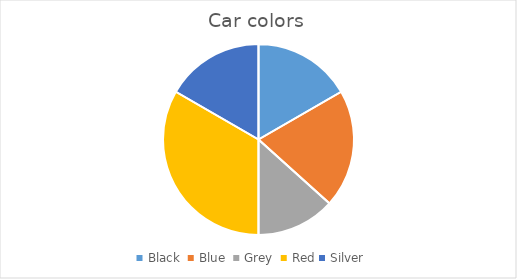
| Category | Series 0 |
|---|---|
| Black  | 5 |
| Blue  | 6 |
| Grey  | 4 |
| Red | 10 |
| Silver | 5 |